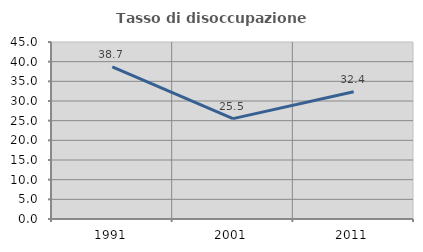
| Category | Tasso di disoccupazione giovanile  |
|---|---|
| 1991.0 | 38.661 |
| 2001.0 | 25.517 |
| 2011.0 | 32.372 |